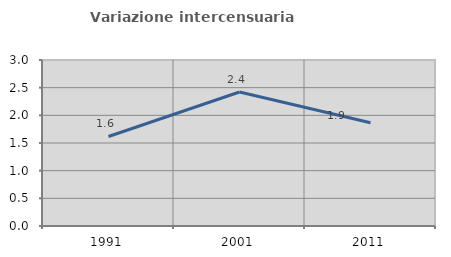
| Category | Variazione intercensuaria annua |
|---|---|
| 1991.0 | 1.618 |
| 2001.0 | 2.421 |
| 2011.0 | 1.867 |